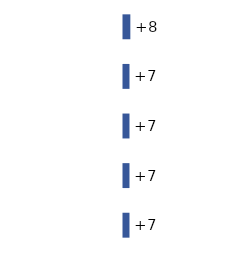
| Category | Series 0 |
|---|---|
| 0 | 8 |
| 1 | 7 |
| 2 | 7 |
| 3 | 7 |
| 4 | 7 |